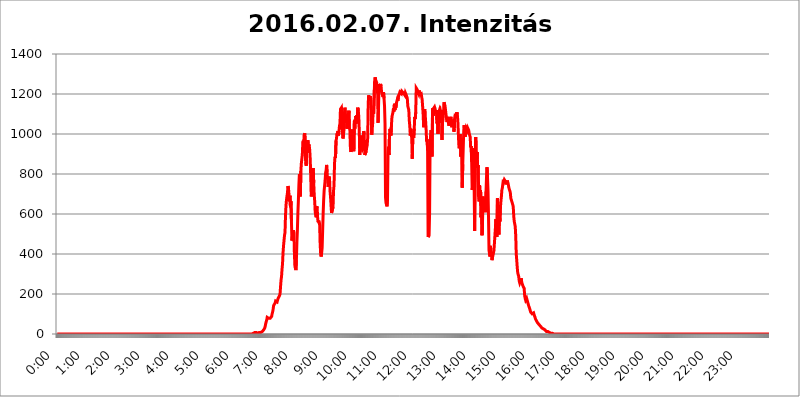
| Category | 2016.02.07. Intenzitás [W/m^2] |
|---|---|
| 0.0 | 0 |
| 0.0006944444444444445 | 0 |
| 0.001388888888888889 | 0 |
| 0.0020833333333333333 | 0 |
| 0.002777777777777778 | 0 |
| 0.003472222222222222 | 0 |
| 0.004166666666666667 | 0 |
| 0.004861111111111111 | 0 |
| 0.005555555555555556 | 0 |
| 0.0062499999999999995 | 0 |
| 0.006944444444444444 | 0 |
| 0.007638888888888889 | 0 |
| 0.008333333333333333 | 0 |
| 0.009027777777777779 | 0 |
| 0.009722222222222222 | 0 |
| 0.010416666666666666 | 0 |
| 0.011111111111111112 | 0 |
| 0.011805555555555555 | 0 |
| 0.012499999999999999 | 0 |
| 0.013194444444444444 | 0 |
| 0.013888888888888888 | 0 |
| 0.014583333333333332 | 0 |
| 0.015277777777777777 | 0 |
| 0.015972222222222224 | 0 |
| 0.016666666666666666 | 0 |
| 0.017361111111111112 | 0 |
| 0.018055555555555557 | 0 |
| 0.01875 | 0 |
| 0.019444444444444445 | 0 |
| 0.02013888888888889 | 0 |
| 0.020833333333333332 | 0 |
| 0.02152777777777778 | 0 |
| 0.022222222222222223 | 0 |
| 0.02291666666666667 | 0 |
| 0.02361111111111111 | 0 |
| 0.024305555555555556 | 0 |
| 0.024999999999999998 | 0 |
| 0.025694444444444447 | 0 |
| 0.02638888888888889 | 0 |
| 0.027083333333333334 | 0 |
| 0.027777777777777776 | 0 |
| 0.02847222222222222 | 0 |
| 0.029166666666666664 | 0 |
| 0.029861111111111113 | 0 |
| 0.030555555555555555 | 0 |
| 0.03125 | 0 |
| 0.03194444444444445 | 0 |
| 0.03263888888888889 | 0 |
| 0.03333333333333333 | 0 |
| 0.034027777777777775 | 0 |
| 0.034722222222222224 | 0 |
| 0.035416666666666666 | 0 |
| 0.036111111111111115 | 0 |
| 0.03680555555555556 | 0 |
| 0.0375 | 0 |
| 0.03819444444444444 | 0 |
| 0.03888888888888889 | 0 |
| 0.03958333333333333 | 0 |
| 0.04027777777777778 | 0 |
| 0.04097222222222222 | 0 |
| 0.041666666666666664 | 0 |
| 0.042361111111111106 | 0 |
| 0.04305555555555556 | 0 |
| 0.043750000000000004 | 0 |
| 0.044444444444444446 | 0 |
| 0.04513888888888889 | 0 |
| 0.04583333333333334 | 0 |
| 0.04652777777777778 | 0 |
| 0.04722222222222222 | 0 |
| 0.04791666666666666 | 0 |
| 0.04861111111111111 | 0 |
| 0.049305555555555554 | 0 |
| 0.049999999999999996 | 0 |
| 0.05069444444444445 | 0 |
| 0.051388888888888894 | 0 |
| 0.052083333333333336 | 0 |
| 0.05277777777777778 | 0 |
| 0.05347222222222222 | 0 |
| 0.05416666666666667 | 0 |
| 0.05486111111111111 | 0 |
| 0.05555555555555555 | 0 |
| 0.05625 | 0 |
| 0.05694444444444444 | 0 |
| 0.057638888888888885 | 0 |
| 0.05833333333333333 | 0 |
| 0.05902777777777778 | 0 |
| 0.059722222222222225 | 0 |
| 0.06041666666666667 | 0 |
| 0.061111111111111116 | 0 |
| 0.06180555555555556 | 0 |
| 0.0625 | 0 |
| 0.06319444444444444 | 0 |
| 0.06388888888888888 | 0 |
| 0.06458333333333334 | 0 |
| 0.06527777777777778 | 0 |
| 0.06597222222222222 | 0 |
| 0.06666666666666667 | 0 |
| 0.06736111111111111 | 0 |
| 0.06805555555555555 | 0 |
| 0.06874999999999999 | 0 |
| 0.06944444444444443 | 0 |
| 0.07013888888888889 | 0 |
| 0.07083333333333333 | 0 |
| 0.07152777777777779 | 0 |
| 0.07222222222222223 | 0 |
| 0.07291666666666667 | 0 |
| 0.07361111111111111 | 0 |
| 0.07430555555555556 | 0 |
| 0.075 | 0 |
| 0.07569444444444444 | 0 |
| 0.0763888888888889 | 0 |
| 0.07708333333333334 | 0 |
| 0.07777777777777778 | 0 |
| 0.07847222222222222 | 0 |
| 0.07916666666666666 | 0 |
| 0.0798611111111111 | 0 |
| 0.08055555555555556 | 0 |
| 0.08125 | 0 |
| 0.08194444444444444 | 0 |
| 0.08263888888888889 | 0 |
| 0.08333333333333333 | 0 |
| 0.08402777777777777 | 0 |
| 0.08472222222222221 | 0 |
| 0.08541666666666665 | 0 |
| 0.08611111111111112 | 0 |
| 0.08680555555555557 | 0 |
| 0.08750000000000001 | 0 |
| 0.08819444444444445 | 0 |
| 0.08888888888888889 | 0 |
| 0.08958333333333333 | 0 |
| 0.09027777777777778 | 0 |
| 0.09097222222222222 | 0 |
| 0.09166666666666667 | 0 |
| 0.09236111111111112 | 0 |
| 0.09305555555555556 | 0 |
| 0.09375 | 0 |
| 0.09444444444444444 | 0 |
| 0.09513888888888888 | 0 |
| 0.09583333333333333 | 0 |
| 0.09652777777777777 | 0 |
| 0.09722222222222222 | 0 |
| 0.09791666666666667 | 0 |
| 0.09861111111111111 | 0 |
| 0.09930555555555555 | 0 |
| 0.09999999999999999 | 0 |
| 0.10069444444444443 | 0 |
| 0.1013888888888889 | 0 |
| 0.10208333333333335 | 0 |
| 0.10277777777777779 | 0 |
| 0.10347222222222223 | 0 |
| 0.10416666666666667 | 0 |
| 0.10486111111111111 | 0 |
| 0.10555555555555556 | 0 |
| 0.10625 | 0 |
| 0.10694444444444444 | 0 |
| 0.1076388888888889 | 0 |
| 0.10833333333333334 | 0 |
| 0.10902777777777778 | 0 |
| 0.10972222222222222 | 0 |
| 0.1111111111111111 | 0 |
| 0.11180555555555556 | 0 |
| 0.11180555555555556 | 0 |
| 0.1125 | 0 |
| 0.11319444444444444 | 0 |
| 0.11388888888888889 | 0 |
| 0.11458333333333333 | 0 |
| 0.11527777777777777 | 0 |
| 0.11597222222222221 | 0 |
| 0.11666666666666665 | 0 |
| 0.1173611111111111 | 0 |
| 0.11805555555555557 | 0 |
| 0.11944444444444445 | 0 |
| 0.12013888888888889 | 0 |
| 0.12083333333333333 | 0 |
| 0.12152777777777778 | 0 |
| 0.12222222222222223 | 0 |
| 0.12291666666666667 | 0 |
| 0.12291666666666667 | 0 |
| 0.12361111111111112 | 0 |
| 0.12430555555555556 | 0 |
| 0.125 | 0 |
| 0.12569444444444444 | 0 |
| 0.12638888888888888 | 0 |
| 0.12708333333333333 | 0 |
| 0.16875 | 0 |
| 0.12847222222222224 | 0 |
| 0.12916666666666668 | 0 |
| 0.12986111111111112 | 0 |
| 0.13055555555555556 | 0 |
| 0.13125 | 0 |
| 0.13194444444444445 | 0 |
| 0.1326388888888889 | 0 |
| 0.13333333333333333 | 0 |
| 0.13402777777777777 | 0 |
| 0.13402777777777777 | 0 |
| 0.13472222222222222 | 0 |
| 0.13541666666666666 | 0 |
| 0.1361111111111111 | 0 |
| 0.13749999999999998 | 0 |
| 0.13819444444444443 | 0 |
| 0.1388888888888889 | 0 |
| 0.13958333333333334 | 0 |
| 0.14027777777777778 | 0 |
| 0.14097222222222222 | 0 |
| 0.14166666666666666 | 0 |
| 0.1423611111111111 | 0 |
| 0.14305555555555557 | 0 |
| 0.14375000000000002 | 0 |
| 0.14444444444444446 | 0 |
| 0.1451388888888889 | 0 |
| 0.1451388888888889 | 0 |
| 0.14652777777777778 | 0 |
| 0.14722222222222223 | 0 |
| 0.14791666666666667 | 0 |
| 0.1486111111111111 | 0 |
| 0.14930555555555555 | 0 |
| 0.15 | 0 |
| 0.15069444444444444 | 0 |
| 0.15138888888888888 | 0 |
| 0.15208333333333332 | 0 |
| 0.15277777777777776 | 0 |
| 0.15347222222222223 | 0 |
| 0.15416666666666667 | 0 |
| 0.15486111111111112 | 0 |
| 0.15555555555555556 | 0 |
| 0.15625 | 0 |
| 0.15694444444444444 | 0 |
| 0.15763888888888888 | 0 |
| 0.15833333333333333 | 0 |
| 0.15902777777777777 | 0 |
| 0.15972222222222224 | 0 |
| 0.16041666666666668 | 0 |
| 0.16111111111111112 | 0 |
| 0.16180555555555556 | 0 |
| 0.1625 | 0 |
| 0.16319444444444445 | 0 |
| 0.1638888888888889 | 0 |
| 0.16458333333333333 | 0 |
| 0.16527777777777777 | 0 |
| 0.16597222222222222 | 0 |
| 0.16666666666666666 | 0 |
| 0.1673611111111111 | 0 |
| 0.16805555555555554 | 0 |
| 0.16874999999999998 | 0 |
| 0.16944444444444443 | 0 |
| 0.17013888888888887 | 0 |
| 0.1708333333333333 | 0 |
| 0.17152777777777775 | 0 |
| 0.17222222222222225 | 0 |
| 0.1729166666666667 | 0 |
| 0.17361111111111113 | 0 |
| 0.17430555555555557 | 0 |
| 0.17500000000000002 | 0 |
| 0.17569444444444446 | 0 |
| 0.1763888888888889 | 0 |
| 0.17708333333333334 | 0 |
| 0.17777777777777778 | 0 |
| 0.17847222222222223 | 0 |
| 0.17916666666666667 | 0 |
| 0.1798611111111111 | 0 |
| 0.18055555555555555 | 0 |
| 0.18125 | 0 |
| 0.18194444444444444 | 0 |
| 0.1826388888888889 | 0 |
| 0.18333333333333335 | 0 |
| 0.1840277777777778 | 0 |
| 0.18472222222222223 | 0 |
| 0.18541666666666667 | 0 |
| 0.18611111111111112 | 0 |
| 0.18680555555555556 | 0 |
| 0.1875 | 0 |
| 0.18819444444444444 | 0 |
| 0.18888888888888888 | 0 |
| 0.18958333333333333 | 0 |
| 0.19027777777777777 | 0 |
| 0.1909722222222222 | 0 |
| 0.19166666666666665 | 0 |
| 0.19236111111111112 | 0 |
| 0.19305555555555554 | 0 |
| 0.19375 | 0 |
| 0.19444444444444445 | 0 |
| 0.1951388888888889 | 0 |
| 0.19583333333333333 | 0 |
| 0.19652777777777777 | 0 |
| 0.19722222222222222 | 0 |
| 0.19791666666666666 | 0 |
| 0.1986111111111111 | 0 |
| 0.19930555555555554 | 0 |
| 0.19999999999999998 | 0 |
| 0.20069444444444443 | 0 |
| 0.20138888888888887 | 0 |
| 0.2020833333333333 | 0 |
| 0.2027777777777778 | 0 |
| 0.2034722222222222 | 0 |
| 0.2041666666666667 | 0 |
| 0.20486111111111113 | 0 |
| 0.20555555555555557 | 0 |
| 0.20625000000000002 | 0 |
| 0.20694444444444446 | 0 |
| 0.2076388888888889 | 0 |
| 0.20833333333333334 | 0 |
| 0.20902777777777778 | 0 |
| 0.20972222222222223 | 0 |
| 0.21041666666666667 | 0 |
| 0.2111111111111111 | 0 |
| 0.21180555555555555 | 0 |
| 0.2125 | 0 |
| 0.21319444444444444 | 0 |
| 0.2138888888888889 | 0 |
| 0.21458333333333335 | 0 |
| 0.2152777777777778 | 0 |
| 0.21597222222222223 | 0 |
| 0.21666666666666667 | 0 |
| 0.21736111111111112 | 0 |
| 0.21805555555555556 | 0 |
| 0.21875 | 0 |
| 0.21944444444444444 | 0 |
| 0.22013888888888888 | 0 |
| 0.22083333333333333 | 0 |
| 0.22152777777777777 | 0 |
| 0.2222222222222222 | 0 |
| 0.22291666666666665 | 0 |
| 0.2236111111111111 | 0 |
| 0.22430555555555556 | 0 |
| 0.225 | 0 |
| 0.22569444444444445 | 0 |
| 0.2263888888888889 | 0 |
| 0.22708333333333333 | 0 |
| 0.22777777777777777 | 0 |
| 0.22847222222222222 | 0 |
| 0.22916666666666666 | 0 |
| 0.2298611111111111 | 0 |
| 0.23055555555555554 | 0 |
| 0.23124999999999998 | 0 |
| 0.23194444444444443 | 0 |
| 0.23263888888888887 | 0 |
| 0.2333333333333333 | 0 |
| 0.2340277777777778 | 0 |
| 0.2347222222222222 | 0 |
| 0.2354166666666667 | 0 |
| 0.23611111111111113 | 0 |
| 0.23680555555555557 | 0 |
| 0.23750000000000002 | 0 |
| 0.23819444444444446 | 0 |
| 0.2388888888888889 | 0 |
| 0.23958333333333334 | 0 |
| 0.24027777777777778 | 0 |
| 0.24097222222222223 | 0 |
| 0.24166666666666667 | 0 |
| 0.2423611111111111 | 0 |
| 0.24305555555555555 | 0 |
| 0.24375 | 0 |
| 0.24444444444444446 | 0 |
| 0.24513888888888888 | 0 |
| 0.24583333333333335 | 0 |
| 0.2465277777777778 | 0 |
| 0.24722222222222223 | 0 |
| 0.24791666666666667 | 0 |
| 0.24861111111111112 | 0 |
| 0.24930555555555556 | 0 |
| 0.25 | 0 |
| 0.25069444444444444 | 0 |
| 0.2513888888888889 | 0 |
| 0.2520833333333333 | 0 |
| 0.25277777777777777 | 0 |
| 0.2534722222222222 | 0 |
| 0.25416666666666665 | 0 |
| 0.2548611111111111 | 0 |
| 0.2555555555555556 | 0 |
| 0.25625000000000003 | 0 |
| 0.2569444444444445 | 0 |
| 0.2576388888888889 | 0 |
| 0.25833333333333336 | 0 |
| 0.2590277777777778 | 0 |
| 0.25972222222222224 | 0 |
| 0.2604166666666667 | 0 |
| 0.2611111111111111 | 0 |
| 0.26180555555555557 | 0 |
| 0.2625 | 0 |
| 0.26319444444444445 | 0 |
| 0.2638888888888889 | 0 |
| 0.26458333333333334 | 0 |
| 0.2652777777777778 | 0 |
| 0.2659722222222222 | 0 |
| 0.26666666666666666 | 0 |
| 0.2673611111111111 | 0 |
| 0.26805555555555555 | 0 |
| 0.26875 | 0 |
| 0.26944444444444443 | 0 |
| 0.2701388888888889 | 0 |
| 0.2708333333333333 | 0 |
| 0.27152777777777776 | 0 |
| 0.2722222222222222 | 0 |
| 0.27291666666666664 | 0 |
| 0.2736111111111111 | 3.525 |
| 0.2743055555555555 | 3.525 |
| 0.27499999999999997 | 3.525 |
| 0.27569444444444446 | 3.525 |
| 0.27638888888888885 | 7.887 |
| 0.27708333333333335 | 7.887 |
| 0.2777777777777778 | 7.887 |
| 0.27847222222222223 | 7.887 |
| 0.2791666666666667 | 7.887 |
| 0.2798611111111111 | 3.525 |
| 0.28055555555555556 | 3.525 |
| 0.28125 | 3.525 |
| 0.28194444444444444 | 3.525 |
| 0.2826388888888889 | 3.525 |
| 0.2833333333333333 | 7.887 |
| 0.28402777777777777 | 7.887 |
| 0.2847222222222222 | 7.887 |
| 0.28541666666666665 | 7.887 |
| 0.28611111111111115 | 12.257 |
| 0.28680555555555554 | 12.257 |
| 0.28750000000000003 | 12.257 |
| 0.2881944444444445 | 16.636 |
| 0.2888888888888889 | 16.636 |
| 0.28958333333333336 | 21.024 |
| 0.2902777777777778 | 25.419 |
| 0.29097222222222224 | 29.823 |
| 0.2916666666666667 | 38.653 |
| 0.2923611111111111 | 51.951 |
| 0.29305555555555557 | 60.85 |
| 0.29375 | 69.775 |
| 0.29444444444444445 | 83.205 |
| 0.2951388888888889 | 87.692 |
| 0.29583333333333334 | 83.205 |
| 0.2965277777777778 | 78.722 |
| 0.2972222222222222 | 74.246 |
| 0.29791666666666666 | 74.246 |
| 0.2986111111111111 | 78.722 |
| 0.29930555555555555 | 83.205 |
| 0.3 | 83.205 |
| 0.30069444444444443 | 87.692 |
| 0.3013888888888889 | 101.184 |
| 0.3020833333333333 | 110.201 |
| 0.30277777777777776 | 123.758 |
| 0.3034722222222222 | 141.884 |
| 0.30416666666666664 | 141.884 |
| 0.3048611111111111 | 141.884 |
| 0.3055555555555555 | 155.509 |
| 0.30624999999999997 | 164.605 |
| 0.3069444444444444 | 164.605 |
| 0.3076388888888889 | 169.156 |
| 0.30833333333333335 | 160.056 |
| 0.3090277777777778 | 164.605 |
| 0.30972222222222223 | 178.264 |
| 0.3104166666666667 | 182.82 |
| 0.3111111111111111 | 182.82 |
| 0.31180555555555556 | 191.937 |
| 0.3125 | 201.058 |
| 0.31319444444444444 | 237.564 |
| 0.3138888888888889 | 269.49 |
| 0.3145833333333333 | 287.709 |
| 0.31527777777777777 | 324.052 |
| 0.3159722222222222 | 351.198 |
| 0.31666666666666665 | 405.108 |
| 0.31736111111111115 | 440.702 |
| 0.31805555555555554 | 467.187 |
| 0.31875000000000003 | 493.475 |
| 0.3194444444444445 | 506.542 |
| 0.3201388888888889 | 592.233 |
| 0.32083333333333336 | 642.4 |
| 0.3215277777777778 | 671.22 |
| 0.32222222222222224 | 671.22 |
| 0.3229166666666667 | 707.8 |
| 0.3236111111111111 | 739.877 |
| 0.32430555555555557 | 727.896 |
| 0.325 | 699.717 |
| 0.32569444444444445 | 663.019 |
| 0.3263888888888889 | 691.608 |
| 0.32708333333333334 | 634.105 |
| 0.3277777777777778 | 663.019 |
| 0.3284722222222222 | 562.53 |
| 0.32916666666666666 | 467.187 |
| 0.3298611111111111 | 489.108 |
| 0.33055555555555555 | 510.885 |
| 0.33125 | 519.555 |
| 0.33194444444444443 | 502.192 |
| 0.3326388888888889 | 400.638 |
| 0.3333333333333333 | 337.639 |
| 0.3340277777777778 | 328.584 |
| 0.3347222222222222 | 319.517 |
| 0.3354166666666667 | 369.23 |
| 0.3361111111111111 | 458.38 |
| 0.3368055555555556 | 519.555 |
| 0.33749999999999997 | 604.864 |
| 0.33819444444444446 | 667.123 |
| 0.33888888888888885 | 743.859 |
| 0.33958333333333335 | 798.974 |
| 0.34027777777777773 | 727.896 |
| 0.34097222222222223 | 687.544 |
| 0.3416666666666666 | 814.519 |
| 0.3423611111111111 | 853.029 |
| 0.3430555555555555 | 849.199 |
| 0.34375 | 898.668 |
| 0.3444444444444445 | 958.814 |
| 0.3451388888888889 | 966.295 |
| 0.3458333333333334 | 940.082 |
| 0.34652777777777777 | 996.182 |
| 0.34722222222222227 | 1003.65 |
| 0.34791666666666665 | 891.099 |
| 0.34861111111111115 | 853.029 |
| 0.34930555555555554 | 841.526 |
| 0.35000000000000003 | 951.327 |
| 0.3506944444444444 | 906.223 |
| 0.3513888888888889 | 970.034 |
| 0.3520833333333333 | 928.819 |
| 0.3527777777777778 | 947.58 |
| 0.3534722222222222 | 940.082 |
| 0.3541666666666667 | 917.534 |
| 0.3548611111111111 | 868.305 |
| 0.35555555555555557 | 783.342 |
| 0.35625 | 687.544 |
| 0.35694444444444445 | 703.762 |
| 0.3576388888888889 | 791.169 |
| 0.35833333333333334 | 791.169 |
| 0.3590277777777778 | 829.981 |
| 0.3597222222222222 | 755.766 |
| 0.36041666666666666 | 695.666 |
| 0.3611111111111111 | 663.019 |
| 0.36180555555555555 | 609.062 |
| 0.3625 | 604.864 |
| 0.36319444444444443 | 583.779 |
| 0.3638888888888889 | 638.256 |
| 0.3645833333333333 | 629.948 |
| 0.3652777777777778 | 575.299 |
| 0.3659722222222222 | 558.261 |
| 0.3666666666666667 | 566.793 |
| 0.3673611111111111 | 562.53 |
| 0.3680555555555556 | 545.416 |
| 0.36874999999999997 | 449.551 |
| 0.36944444444444446 | 400.638 |
| 0.37013888888888885 | 387.202 |
| 0.37083333333333335 | 405.108 |
| 0.37152777777777773 | 431.833 |
| 0.37222222222222223 | 515.223 |
| 0.3729166666666666 | 600.661 |
| 0.3736111111111111 | 667.123 |
| 0.3743055555555555 | 715.858 |
| 0.375 | 715.858 |
| 0.3756944444444445 | 767.62 |
| 0.3763888888888889 | 806.757 |
| 0.3770833333333334 | 818.392 |
| 0.37777777777777777 | 845.365 |
| 0.37847222222222227 | 806.757 |
| 0.37916666666666665 | 775.492 |
| 0.37986111111111115 | 735.89 |
| 0.38055555555555554 | 743.859 |
| 0.38125000000000003 | 787.258 |
| 0.3819444444444444 | 771.559 |
| 0.3826388888888889 | 711.832 |
| 0.3833333333333333 | 683.473 |
| 0.3840277777777778 | 642.4 |
| 0.3847222222222222 | 604.864 |
| 0.3854166666666667 | 604.864 |
| 0.3861111111111111 | 609.062 |
| 0.38680555555555557 | 634.105 |
| 0.3875 | 715.858 |
| 0.38819444444444445 | 743.859 |
| 0.3888888888888889 | 853.029 |
| 0.38958333333333334 | 887.309 |
| 0.3902777777777778 | 879.719 |
| 0.3909722222222222 | 966.295 |
| 0.39166666666666666 | 977.508 |
| 0.3923611111111111 | 1003.65 |
| 0.39305555555555555 | 996.182 |
| 0.39375 | 1014.852 |
| 0.39444444444444443 | 992.448 |
| 0.3951388888888889 | 1014.852 |
| 0.3958333333333333 | 1041.019 |
| 0.3965277777777778 | 1052.255 |
| 0.3972222222222222 | 1124.056 |
| 0.3979166666666667 | 1127.879 |
| 0.3986111111111111 | 1131.708 |
| 0.3993055555555556 | 1097.437 |
| 0.39999999999999997 | 1007.383 |
| 0.40069444444444446 | 977.508 |
| 0.40138888888888885 | 996.182 |
| 0.40208333333333335 | 1018.587 |
| 0.40277777777777773 | 1101.226 |
| 0.40347222222222223 | 1131.708 |
| 0.4041666666666666 | 1093.653 |
| 0.4048611111111111 | 1086.097 |
| 0.4055555555555555 | 1078.555 |
| 0.40625 | 1026.06 |
| 0.4069444444444445 | 1078.555 |
| 0.4076388888888889 | 1101.226 |
| 0.4083333333333334 | 1093.653 |
| 0.40902777777777777 | 1116.426 |
| 0.40972222222222227 | 1029.798 |
| 0.41041666666666665 | 1018.587 |
| 0.41111111111111115 | 936.33 |
| 0.41180555555555554 | 909.996 |
| 0.41250000000000003 | 906.223 |
| 0.4131944444444444 | 951.327 |
| 0.4138888888888889 | 1022.323 |
| 0.4145833333333333 | 970.034 |
| 0.4152777777777778 | 951.327 |
| 0.4159722222222222 | 913.766 |
| 0.4166666666666667 | 1052.255 |
| 0.4173611111111111 | 1056.004 |
| 0.41805555555555557 | 1044.762 |
| 0.41875 | 1089.873 |
| 0.41944444444444445 | 1052.255 |
| 0.4201388888888889 | 1093.653 |
| 0.42083333333333334 | 1071.027 |
| 0.4215277777777778 | 1131.708 |
| 0.4222222222222222 | 1116.426 |
| 0.42291666666666666 | 1086.097 |
| 0.4236111111111111 | 1011.118 |
| 0.42430555555555555 | 894.885 |
| 0.425 | 962.555 |
| 0.42569444444444443 | 992.448 |
| 0.4263888888888889 | 940.082 |
| 0.4270833333333333 | 940.082 |
| 0.4277777777777778 | 925.06 |
| 0.4284722222222222 | 932.576 |
| 0.4291666666666667 | 984.98 |
| 0.4298611111111111 | 1014.852 |
| 0.4305555555555556 | 999.916 |
| 0.43124999999999997 | 894.885 |
| 0.43194444444444446 | 894.885 |
| 0.43263888888888885 | 898.668 |
| 0.43333333333333335 | 913.766 |
| 0.43402777777777773 | 932.576 |
| 0.43472222222222223 | 943.832 |
| 0.4354166666666666 | 981.244 |
| 0.4361111111111111 | 1150.946 |
| 0.4368055555555555 | 1193.918 |
| 0.4375 | 1174.263 |
| 0.4381944444444445 | 1166.46 |
| 0.4388888888888889 | 1189.969 |
| 0.4395833333333334 | 1166.46 |
| 0.44027777777777777 | 1116.426 |
| 0.44097222222222227 | 996.182 |
| 0.44166666666666665 | 1018.587 |
| 0.44236111111111115 | 1052.255 |
| 0.44305555555555554 | 1120.238 |
| 0.44375000000000003 | 1101.226 |
| 0.4444444444444444 | 1101.226 |
| 0.4451388888888889 | 1262.649 |
| 0.4458333333333333 | 1283.541 |
| 0.4465277777777778 | 1270.964 |
| 0.4472222222222222 | 1266.8 |
| 0.4479166666666667 | 1258.511 |
| 0.4486111111111111 | 1238.014 |
| 0.44930555555555557 | 1209.807 |
| 0.45 | 1056.004 |
| 0.45069444444444445 | 1147.086 |
| 0.4513888888888889 | 1250.275 |
| 0.45208333333333334 | 1246.176 |
| 0.4527777777777778 | 1229.899 |
| 0.4534722222222222 | 1250.275 |
| 0.45416666666666666 | 1238.014 |
| 0.4548611111111111 | 1209.807 |
| 0.45555555555555555 | 1205.82 |
| 0.45625 | 1209.807 |
| 0.45694444444444443 | 1186.03 |
| 0.4576388888888889 | 1209.807 |
| 0.4583333333333333 | 1178.177 |
| 0.4590277777777778 | 1139.384 |
| 0.4597222222222222 | 1052.255 |
| 0.4604166666666667 | 683.473 |
| 0.4611111111111111 | 654.791 |
| 0.4618055555555556 | 654.791 |
| 0.46249999999999997 | 638.256 |
| 0.46319444444444446 | 675.311 |
| 0.46388888888888885 | 894.885 |
| 0.46458333333333335 | 936.33 |
| 0.46527777777777773 | 894.885 |
| 0.46597222222222223 | 996.182 |
| 0.4666666666666666 | 1026.06 |
| 0.4673611111111111 | 1026.06 |
| 0.4680555555555555 | 992.448 |
| 0.46875 | 1044.762 |
| 0.4694444444444445 | 1086.097 |
| 0.4701388888888889 | 1086.097 |
| 0.4708333333333334 | 1108.816 |
| 0.47152777777777777 | 1127.879 |
| 0.47222222222222227 | 1112.618 |
| 0.47291666666666665 | 1150.946 |
| 0.47361111111111115 | 1120.238 |
| 0.47430555555555554 | 1139.384 |
| 0.47500000000000003 | 1131.708 |
| 0.4756944444444444 | 1154.814 |
| 0.4763888888888889 | 1154.814 |
| 0.4770833333333333 | 1174.263 |
| 0.4777777777777778 | 1166.46 |
| 0.4784722222222222 | 1186.03 |
| 0.4791666666666667 | 1186.03 |
| 0.4798611111111111 | 1201.843 |
| 0.48055555555555557 | 1209.807 |
| 0.48125 | 1213.804 |
| 0.48194444444444445 | 1205.82 |
| 0.4826388888888889 | 1201.843 |
| 0.48333333333333334 | 1213.804 |
| 0.4840277777777778 | 1213.804 |
| 0.4847222222222222 | 1209.807 |
| 0.48541666666666666 | 1205.82 |
| 0.4861111111111111 | 1209.807 |
| 0.48680555555555555 | 1205.82 |
| 0.4875 | 1193.918 |
| 0.48819444444444443 | 1205.82 |
| 0.4888888888888889 | 1201.843 |
| 0.4895833333333333 | 1193.918 |
| 0.4902777777777778 | 1189.969 |
| 0.4909722222222222 | 1178.177 |
| 0.4916666666666667 | 1139.384 |
| 0.4923611111111111 | 1135.543 |
| 0.4930555555555556 | 1120.238 |
| 0.49374999999999997 | 1067.267 |
| 0.49444444444444446 | 1041.019 |
| 0.49513888888888885 | 992.448 |
| 0.49583333333333335 | 1026.06 |
| 0.49652777777777773 | 1011.118 |
| 0.49722222222222223 | 973.772 |
| 0.4979166666666666 | 875.918 |
| 0.4986111111111111 | 973.772 |
| 0.4993055555555555 | 992.448 |
| 0.5 | 981.244 |
| 0.5006944444444444 | 1026.06 |
| 0.5013888888888889 | 1086.097 |
| 0.5020833333333333 | 1074.789 |
| 0.5027777777777778 | 1108.816 |
| 0.5034722222222222 | 1229.899 |
| 0.5041666666666667 | 1229.899 |
| 0.5048611111111111 | 1221.83 |
| 0.5055555555555555 | 1213.804 |
| 0.50625 | 1213.804 |
| 0.5069444444444444 | 1201.843 |
| 0.5076388888888889 | 1217.812 |
| 0.5083333333333333 | 1197.876 |
| 0.5090277777777777 | 1193.918 |
| 0.5097222222222222 | 1201.843 |
| 0.5104166666666666 | 1201.843 |
| 0.5111111111111112 | 1186.03 |
| 0.5118055555555555 | 1170.358 |
| 0.5125000000000001 | 1135.543 |
| 0.5131944444444444 | 1097.437 |
| 0.513888888888889 | 1033.537 |
| 0.5145833333333333 | 1037.277 |
| 0.5152777777777778 | 1124.056 |
| 0.5159722222222222 | 1101.226 |
| 0.5166666666666667 | 1063.51 |
| 0.517361111111111 | 1022.323 |
| 0.5180555555555556 | 962.555 |
| 0.5187499999999999 | 973.772 |
| 0.5194444444444445 | 917.534 |
| 0.5201388888888888 | 484.735 |
| 0.5208333333333334 | 489.108 |
| 0.5215277777777778 | 493.475 |
| 0.5222222222222223 | 604.864 |
| 0.5229166666666667 | 943.832 |
| 0.5236111111111111 | 992.448 |
| 0.5243055555555556 | 1018.587 |
| 0.525 | 970.034 |
| 0.5256944444444445 | 887.309 |
| 0.5263888888888889 | 1127.879 |
| 0.5270833333333333 | 1089.873 |
| 0.5277777777777778 | 1127.879 |
| 0.5284722222222222 | 1131.708 |
| 0.5291666666666667 | 1135.543 |
| 0.5298611111111111 | 1127.879 |
| 0.5305555555555556 | 1127.879 |
| 0.53125 | 1101.226 |
| 0.5319444444444444 | 1120.238 |
| 0.5326388888888889 | 1052.255 |
| 0.5333333333333333 | 1059.756 |
| 0.5340277777777778 | 999.916 |
| 0.5347222222222222 | 1052.255 |
| 0.5354166666666667 | 1112.618 |
| 0.5361111111111111 | 1120.238 |
| 0.5368055555555555 | 1108.816 |
| 0.5375 | 1116.426 |
| 0.5381944444444444 | 1116.426 |
| 0.5388888888888889 | 1093.653 |
| 0.5395833333333333 | 970.034 |
| 0.5402777777777777 | 1056.004 |
| 0.5409722222222222 | 1071.027 |
| 0.5416666666666666 | 1101.226 |
| 0.5423611111111112 | 1158.689 |
| 0.5430555555555555 | 1150.946 |
| 0.5437500000000001 | 1143.232 |
| 0.5444444444444444 | 1124.056 |
| 0.545138888888889 | 1101.226 |
| 0.5458333333333333 | 1101.226 |
| 0.5465277777777778 | 1059.756 |
| 0.5472222222222222 | 1067.267 |
| 0.5479166666666667 | 1086.097 |
| 0.548611111111111 | 1056.004 |
| 0.5493055555555556 | 1041.019 |
| 0.5499999999999999 | 1044.762 |
| 0.5506944444444445 | 1044.762 |
| 0.5513888888888888 | 1067.267 |
| 0.5520833333333334 | 1086.097 |
| 0.5527777777777778 | 1063.51 |
| 0.5534722222222223 | 1033.537 |
| 0.5541666666666667 | 1056.004 |
| 0.5548611111111111 | 1056.004 |
| 0.5555555555555556 | 1063.51 |
| 0.55625 | 1011.118 |
| 0.5569444444444445 | 1026.06 |
| 0.5576388888888889 | 1086.097 |
| 0.5583333333333333 | 1101.226 |
| 0.5590277777777778 | 1086.097 |
| 0.5597222222222222 | 1078.555 |
| 0.5604166666666667 | 1108.816 |
| 0.5611111111111111 | 1097.437 |
| 0.5618055555555556 | 1067.267 |
| 0.5625 | 1067.267 |
| 0.5631944444444444 | 947.58 |
| 0.5638888888888889 | 928.819 |
| 0.5645833333333333 | 973.772 |
| 0.5652777777777778 | 999.916 |
| 0.5659722222222222 | 887.309 |
| 0.5666666666666667 | 909.996 |
| 0.5673611111111111 | 977.508 |
| 0.5680555555555555 | 731.896 |
| 0.56875 | 849.199 |
| 0.5694444444444444 | 845.365 |
| 0.5701388888888889 | 1018.587 |
| 0.5708333333333333 | 1044.762 |
| 0.5715277777777777 | 992.448 |
| 0.5722222222222222 | 984.98 |
| 0.5729166666666666 | 1014.852 |
| 0.5736111111111112 | 1029.798 |
| 0.5743055555555555 | 1029.798 |
| 0.5750000000000001 | 1018.587 |
| 0.5756944444444444 | 1029.798 |
| 0.576388888888889 | 1026.06 |
| 0.5770833333333333 | 1018.587 |
| 0.5777777777777778 | 1003.65 |
| 0.5784722222222222 | 992.448 |
| 0.5791666666666667 | 984.98 |
| 0.579861111111111 | 932.576 |
| 0.5805555555555556 | 940.082 |
| 0.5812499999999999 | 860.676 |
| 0.5819444444444445 | 719.877 |
| 0.5826388888888888 | 739.877 |
| 0.5833333333333334 | 928.819 |
| 0.5840277777777778 | 925.06 |
| 0.5847222222222223 | 731.896 |
| 0.5854166666666667 | 515.223 |
| 0.5861111111111111 | 853.029 |
| 0.5868055555555556 | 984.98 |
| 0.5875 | 947.58 |
| 0.5881944444444445 | 875.918 |
| 0.5888888888888889 | 909.996 |
| 0.5895833333333333 | 829.981 |
| 0.5902777777777778 | 845.365 |
| 0.5909722222222222 | 687.544 |
| 0.5916666666666667 | 663.019 |
| 0.5923611111111111 | 743.859 |
| 0.5930555555555556 | 699.717 |
| 0.59375 | 719.877 |
| 0.5944444444444444 | 583.779 |
| 0.5951388888888889 | 629.948 |
| 0.5958333333333333 | 493.475 |
| 0.5965277777777778 | 575.299 |
| 0.5972222222222222 | 687.544 |
| 0.5979166666666667 | 638.256 |
| 0.5986111111111111 | 654.791 |
| 0.5993055555555555 | 675.311 |
| 0.6 | 658.909 |
| 0.6006944444444444 | 609.062 |
| 0.6013888888888889 | 711.832 |
| 0.6020833333333333 | 787.258 |
| 0.6027777777777777 | 833.834 |
| 0.6034722222222222 | 779.42 |
| 0.6041666666666666 | 715.858 |
| 0.6048611111111112 | 588.009 |
| 0.6055555555555555 | 418.492 |
| 0.6062500000000001 | 414.035 |
| 0.6069444444444444 | 387.202 |
| 0.607638888888889 | 440.702 |
| 0.6083333333333333 | 405.108 |
| 0.6090277777777778 | 396.164 |
| 0.6097222222222222 | 369.23 |
| 0.6104166666666667 | 382.715 |
| 0.611111111111111 | 378.224 |
| 0.6118055555555556 | 405.108 |
| 0.6124999999999999 | 418.492 |
| 0.6131944444444445 | 422.943 |
| 0.6138888888888888 | 414.035 |
| 0.6145833333333334 | 532.513 |
| 0.6152777777777778 | 575.299 |
| 0.6159722222222223 | 497.836 |
| 0.6166666666666667 | 484.735 |
| 0.6173611111111111 | 679.395 |
| 0.6180555555555556 | 634.105 |
| 0.61875 | 566.793 |
| 0.6194444444444445 | 497.836 |
| 0.6201388888888889 | 592.233 |
| 0.6208333333333333 | 562.53 |
| 0.6215277777777778 | 629.948 |
| 0.6222222222222222 | 663.019 |
| 0.6229166666666667 | 687.544 |
| 0.6236111111111111 | 719.877 |
| 0.6243055555555556 | 731.896 |
| 0.625 | 751.803 |
| 0.6256944444444444 | 771.559 |
| 0.6263888888888889 | 763.674 |
| 0.6270833333333333 | 771.559 |
| 0.6277777777777778 | 775.492 |
| 0.6284722222222222 | 767.62 |
| 0.6291666666666667 | 759.723 |
| 0.6298611111111111 | 747.834 |
| 0.6305555555555555 | 759.723 |
| 0.63125 | 767.62 |
| 0.6319444444444444 | 755.766 |
| 0.6326388888888889 | 747.834 |
| 0.6333333333333333 | 731.896 |
| 0.6340277777777777 | 731.896 |
| 0.6347222222222222 | 731.896 |
| 0.6354166666666666 | 707.8 |
| 0.6361111111111112 | 679.395 |
| 0.6368055555555555 | 671.22 |
| 0.6375000000000001 | 667.123 |
| 0.6381944444444444 | 667.123 |
| 0.638888888888889 | 646.537 |
| 0.6395833333333333 | 634.105 |
| 0.6402777777777778 | 588.009 |
| 0.6409722222222222 | 562.53 |
| 0.6416666666666667 | 549.704 |
| 0.642361111111111 | 536.82 |
| 0.6430555555555556 | 489.108 |
| 0.6437499999999999 | 400.638 |
| 0.6444444444444445 | 369.23 |
| 0.6451388888888888 | 333.113 |
| 0.6458333333333334 | 305.898 |
| 0.6465277777777778 | 301.354 |
| 0.6472222222222223 | 287.709 |
| 0.6479166666666667 | 264.932 |
| 0.6486111111111111 | 255.813 |
| 0.6493055555555556 | 255.813 |
| 0.65 | 269.49 |
| 0.6506944444444445 | 278.603 |
| 0.6513888888888889 | 260.373 |
| 0.6520833333333333 | 251.251 |
| 0.6527777777777778 | 246.689 |
| 0.6534722222222222 | 237.564 |
| 0.6541666666666667 | 242.127 |
| 0.6548611111111111 | 228.436 |
| 0.6555555555555556 | 191.937 |
| 0.65625 | 178.264 |
| 0.6569444444444444 | 169.156 |
| 0.6576388888888889 | 169.156 |
| 0.6583333333333333 | 178.264 |
| 0.6590277777777778 | 173.709 |
| 0.6597222222222222 | 160.056 |
| 0.6604166666666667 | 150.964 |
| 0.6611111111111111 | 141.884 |
| 0.6618055555555555 | 137.347 |
| 0.6625 | 128.284 |
| 0.6631944444444444 | 119.235 |
| 0.6638888888888889 | 110.201 |
| 0.6645833333333333 | 110.201 |
| 0.6652777777777777 | 105.69 |
| 0.6659722222222222 | 101.184 |
| 0.6666666666666666 | 105.69 |
| 0.6673611111111111 | 105.69 |
| 0.6680555555555556 | 105.69 |
| 0.6687500000000001 | 96.682 |
| 0.6694444444444444 | 92.184 |
| 0.6701388888888888 | 83.205 |
| 0.6708333333333334 | 74.246 |
| 0.6715277777777778 | 69.775 |
| 0.6722222222222222 | 65.31 |
| 0.6729166666666666 | 60.85 |
| 0.6736111111111112 | 56.398 |
| 0.6743055555555556 | 56.398 |
| 0.6749999999999999 | 51.951 |
| 0.6756944444444444 | 47.511 |
| 0.6763888888888889 | 43.079 |
| 0.6770833333333334 | 43.079 |
| 0.6777777777777777 | 38.653 |
| 0.6784722222222223 | 38.653 |
| 0.6791666666666667 | 34.234 |
| 0.6798611111111111 | 29.823 |
| 0.6805555555555555 | 29.823 |
| 0.68125 | 29.823 |
| 0.6819444444444445 | 25.419 |
| 0.6826388888888889 | 21.024 |
| 0.6833333333333332 | 21.024 |
| 0.6840277777777778 | 21.024 |
| 0.6847222222222222 | 16.636 |
| 0.6854166666666667 | 16.636 |
| 0.686111111111111 | 12.257 |
| 0.6868055555555556 | 12.257 |
| 0.6875 | 12.257 |
| 0.6881944444444444 | 12.257 |
| 0.688888888888889 | 7.887 |
| 0.6895833333333333 | 7.887 |
| 0.6902777777777778 | 7.887 |
| 0.6909722222222222 | 3.525 |
| 0.6916666666666668 | 3.525 |
| 0.6923611111111111 | 3.525 |
| 0.6930555555555555 | 3.525 |
| 0.69375 | 3.525 |
| 0.6944444444444445 | 3.525 |
| 0.6951388888888889 | 3.525 |
| 0.6958333333333333 | 3.525 |
| 0.6965277777777777 | 0 |
| 0.6972222222222223 | 0 |
| 0.6979166666666666 | 0 |
| 0.6986111111111111 | 0 |
| 0.6993055555555556 | 0 |
| 0.7000000000000001 | 0 |
| 0.7006944444444444 | 0 |
| 0.7013888888888888 | 0 |
| 0.7020833333333334 | 0 |
| 0.7027777777777778 | 0 |
| 0.7034722222222222 | 0 |
| 0.7041666666666666 | 0 |
| 0.7048611111111112 | 0 |
| 0.7055555555555556 | 0 |
| 0.7062499999999999 | 0 |
| 0.7069444444444444 | 0 |
| 0.7076388888888889 | 0 |
| 0.7083333333333334 | 0 |
| 0.7090277777777777 | 0 |
| 0.7097222222222223 | 0 |
| 0.7104166666666667 | 0 |
| 0.7111111111111111 | 0 |
| 0.7118055555555555 | 0 |
| 0.7125 | 0 |
| 0.7131944444444445 | 0 |
| 0.7138888888888889 | 0 |
| 0.7145833333333332 | 0 |
| 0.7152777777777778 | 0 |
| 0.7159722222222222 | 0 |
| 0.7166666666666667 | 0 |
| 0.717361111111111 | 0 |
| 0.7180555555555556 | 0 |
| 0.71875 | 0 |
| 0.7194444444444444 | 0 |
| 0.720138888888889 | 0 |
| 0.7208333333333333 | 0 |
| 0.7215277777777778 | 0 |
| 0.7222222222222222 | 0 |
| 0.7229166666666668 | 0 |
| 0.7236111111111111 | 0 |
| 0.7243055555555555 | 0 |
| 0.725 | 0 |
| 0.7256944444444445 | 0 |
| 0.7263888888888889 | 0 |
| 0.7270833333333333 | 0 |
| 0.7277777777777777 | 0 |
| 0.7284722222222223 | 0 |
| 0.7291666666666666 | 0 |
| 0.7298611111111111 | 0 |
| 0.7305555555555556 | 0 |
| 0.7312500000000001 | 0 |
| 0.7319444444444444 | 0 |
| 0.7326388888888888 | 0 |
| 0.7333333333333334 | 0 |
| 0.7340277777777778 | 0 |
| 0.7347222222222222 | 0 |
| 0.7354166666666666 | 0 |
| 0.7361111111111112 | 0 |
| 0.7368055555555556 | 0 |
| 0.7374999999999999 | 0 |
| 0.7381944444444444 | 0 |
| 0.7388888888888889 | 0 |
| 0.7395833333333334 | 0 |
| 0.7402777777777777 | 0 |
| 0.7409722222222223 | 0 |
| 0.7416666666666667 | 0 |
| 0.7423611111111111 | 0 |
| 0.7430555555555555 | 0 |
| 0.74375 | 0 |
| 0.7444444444444445 | 0 |
| 0.7451388888888889 | 0 |
| 0.7458333333333332 | 0 |
| 0.7465277777777778 | 0 |
| 0.7472222222222222 | 0 |
| 0.7479166666666667 | 0 |
| 0.748611111111111 | 0 |
| 0.7493055555555556 | 0 |
| 0.75 | 0 |
| 0.7506944444444444 | 0 |
| 0.751388888888889 | 0 |
| 0.7520833333333333 | 0 |
| 0.7527777777777778 | 0 |
| 0.7534722222222222 | 0 |
| 0.7541666666666668 | 0 |
| 0.7548611111111111 | 0 |
| 0.7555555555555555 | 0 |
| 0.75625 | 0 |
| 0.7569444444444445 | 0 |
| 0.7576388888888889 | 0 |
| 0.7583333333333333 | 0 |
| 0.7590277777777777 | 0 |
| 0.7597222222222223 | 0 |
| 0.7604166666666666 | 0 |
| 0.7611111111111111 | 0 |
| 0.7618055555555556 | 0 |
| 0.7625000000000001 | 0 |
| 0.7631944444444444 | 0 |
| 0.7638888888888888 | 0 |
| 0.7645833333333334 | 0 |
| 0.7652777777777778 | 0 |
| 0.7659722222222222 | 0 |
| 0.7666666666666666 | 0 |
| 0.7673611111111112 | 0 |
| 0.7680555555555556 | 0 |
| 0.7687499999999999 | 0 |
| 0.7694444444444444 | 0 |
| 0.7701388888888889 | 0 |
| 0.7708333333333334 | 0 |
| 0.7715277777777777 | 0 |
| 0.7722222222222223 | 0 |
| 0.7729166666666667 | 0 |
| 0.7736111111111111 | 0 |
| 0.7743055555555555 | 0 |
| 0.775 | 0 |
| 0.7756944444444445 | 0 |
| 0.7763888888888889 | 0 |
| 0.7770833333333332 | 0 |
| 0.7777777777777778 | 0 |
| 0.7784722222222222 | 0 |
| 0.7791666666666667 | 0 |
| 0.779861111111111 | 0 |
| 0.7805555555555556 | 0 |
| 0.78125 | 0 |
| 0.7819444444444444 | 0 |
| 0.782638888888889 | 0 |
| 0.7833333333333333 | 0 |
| 0.7840277777777778 | 0 |
| 0.7847222222222222 | 0 |
| 0.7854166666666668 | 0 |
| 0.7861111111111111 | 0 |
| 0.7868055555555555 | 0 |
| 0.7875 | 0 |
| 0.7881944444444445 | 0 |
| 0.7888888888888889 | 0 |
| 0.7895833333333333 | 0 |
| 0.7902777777777777 | 0 |
| 0.7909722222222223 | 0 |
| 0.7916666666666666 | 0 |
| 0.7923611111111111 | 0 |
| 0.7930555555555556 | 0 |
| 0.7937500000000001 | 0 |
| 0.7944444444444444 | 0 |
| 0.7951388888888888 | 0 |
| 0.7958333333333334 | 0 |
| 0.7965277777777778 | 0 |
| 0.7972222222222222 | 0 |
| 0.7979166666666666 | 0 |
| 0.7986111111111112 | 0 |
| 0.7993055555555556 | 0 |
| 0.7999999999999999 | 0 |
| 0.8006944444444444 | 0 |
| 0.8013888888888889 | 0 |
| 0.8020833333333334 | 0 |
| 0.8027777777777777 | 0 |
| 0.8034722222222223 | 0 |
| 0.8041666666666667 | 0 |
| 0.8048611111111111 | 0 |
| 0.8055555555555555 | 0 |
| 0.80625 | 0 |
| 0.8069444444444445 | 0 |
| 0.8076388888888889 | 0 |
| 0.8083333333333332 | 0 |
| 0.8090277777777778 | 0 |
| 0.8097222222222222 | 0 |
| 0.8104166666666667 | 0 |
| 0.811111111111111 | 0 |
| 0.8118055555555556 | 0 |
| 0.8125 | 0 |
| 0.8131944444444444 | 0 |
| 0.813888888888889 | 0 |
| 0.8145833333333333 | 0 |
| 0.8152777777777778 | 0 |
| 0.8159722222222222 | 0 |
| 0.8166666666666668 | 0 |
| 0.8173611111111111 | 0 |
| 0.8180555555555555 | 0 |
| 0.81875 | 0 |
| 0.8194444444444445 | 0 |
| 0.8201388888888889 | 0 |
| 0.8208333333333333 | 0 |
| 0.8215277777777777 | 0 |
| 0.8222222222222223 | 0 |
| 0.8229166666666666 | 0 |
| 0.8236111111111111 | 0 |
| 0.8243055555555556 | 0 |
| 0.8250000000000001 | 0 |
| 0.8256944444444444 | 0 |
| 0.8263888888888888 | 0 |
| 0.8270833333333334 | 0 |
| 0.8277777777777778 | 0 |
| 0.8284722222222222 | 0 |
| 0.8291666666666666 | 0 |
| 0.8298611111111112 | 0 |
| 0.8305555555555556 | 0 |
| 0.8312499999999999 | 0 |
| 0.8319444444444444 | 0 |
| 0.8326388888888889 | 0 |
| 0.8333333333333334 | 0 |
| 0.8340277777777777 | 0 |
| 0.8347222222222223 | 0 |
| 0.8354166666666667 | 0 |
| 0.8361111111111111 | 0 |
| 0.8368055555555555 | 0 |
| 0.8375 | 0 |
| 0.8381944444444445 | 0 |
| 0.8388888888888889 | 0 |
| 0.8395833333333332 | 0 |
| 0.8402777777777778 | 0 |
| 0.8409722222222222 | 0 |
| 0.8416666666666667 | 0 |
| 0.842361111111111 | 0 |
| 0.8430555555555556 | 0 |
| 0.84375 | 0 |
| 0.8444444444444444 | 0 |
| 0.845138888888889 | 0 |
| 0.8458333333333333 | 0 |
| 0.8465277777777778 | 0 |
| 0.8472222222222222 | 0 |
| 0.8479166666666668 | 0 |
| 0.8486111111111111 | 0 |
| 0.8493055555555555 | 0 |
| 0.85 | 0 |
| 0.8506944444444445 | 0 |
| 0.8513888888888889 | 0 |
| 0.8520833333333333 | 0 |
| 0.8527777777777777 | 0 |
| 0.8534722222222223 | 0 |
| 0.8541666666666666 | 0 |
| 0.8548611111111111 | 0 |
| 0.8555555555555556 | 0 |
| 0.8562500000000001 | 0 |
| 0.8569444444444444 | 0 |
| 0.8576388888888888 | 0 |
| 0.8583333333333334 | 0 |
| 0.8590277777777778 | 0 |
| 0.8597222222222222 | 0 |
| 0.8604166666666666 | 0 |
| 0.8611111111111112 | 0 |
| 0.8618055555555556 | 0 |
| 0.8624999999999999 | 0 |
| 0.8631944444444444 | 0 |
| 0.8638888888888889 | 0 |
| 0.8645833333333334 | 0 |
| 0.8652777777777777 | 0 |
| 0.8659722222222223 | 0 |
| 0.8666666666666667 | 0 |
| 0.8673611111111111 | 0 |
| 0.8680555555555555 | 0 |
| 0.86875 | 0 |
| 0.8694444444444445 | 0 |
| 0.8701388888888889 | 0 |
| 0.8708333333333332 | 0 |
| 0.8715277777777778 | 0 |
| 0.8722222222222222 | 0 |
| 0.8729166666666667 | 0 |
| 0.873611111111111 | 0 |
| 0.8743055555555556 | 0 |
| 0.875 | 0 |
| 0.8756944444444444 | 0 |
| 0.876388888888889 | 0 |
| 0.8770833333333333 | 0 |
| 0.8777777777777778 | 0 |
| 0.8784722222222222 | 0 |
| 0.8791666666666668 | 0 |
| 0.8798611111111111 | 0 |
| 0.8805555555555555 | 0 |
| 0.88125 | 0 |
| 0.8819444444444445 | 0 |
| 0.8826388888888889 | 0 |
| 0.8833333333333333 | 0 |
| 0.8840277777777777 | 0 |
| 0.8847222222222223 | 0 |
| 0.8854166666666666 | 0 |
| 0.8861111111111111 | 0 |
| 0.8868055555555556 | 0 |
| 0.8875000000000001 | 0 |
| 0.8881944444444444 | 0 |
| 0.8888888888888888 | 0 |
| 0.8895833333333334 | 0 |
| 0.8902777777777778 | 0 |
| 0.8909722222222222 | 0 |
| 0.8916666666666666 | 0 |
| 0.8923611111111112 | 0 |
| 0.8930555555555556 | 0 |
| 0.8937499999999999 | 0 |
| 0.8944444444444444 | 0 |
| 0.8951388888888889 | 0 |
| 0.8958333333333334 | 0 |
| 0.8965277777777777 | 0 |
| 0.8972222222222223 | 0 |
| 0.8979166666666667 | 0 |
| 0.8986111111111111 | 0 |
| 0.8993055555555555 | 0 |
| 0.9 | 0 |
| 0.9006944444444445 | 0 |
| 0.9013888888888889 | 0 |
| 0.9020833333333332 | 0 |
| 0.9027777777777778 | 0 |
| 0.9034722222222222 | 0 |
| 0.9041666666666667 | 0 |
| 0.904861111111111 | 0 |
| 0.9055555555555556 | 0 |
| 0.90625 | 0 |
| 0.9069444444444444 | 0 |
| 0.907638888888889 | 0 |
| 0.9083333333333333 | 0 |
| 0.9090277777777778 | 0 |
| 0.9097222222222222 | 0 |
| 0.9104166666666668 | 0 |
| 0.9111111111111111 | 0 |
| 0.9118055555555555 | 0 |
| 0.9125 | 0 |
| 0.9131944444444445 | 0 |
| 0.9138888888888889 | 0 |
| 0.9145833333333333 | 0 |
| 0.9152777777777777 | 0 |
| 0.9159722222222223 | 0 |
| 0.9166666666666666 | 0 |
| 0.9173611111111111 | 0 |
| 0.9180555555555556 | 0 |
| 0.9187500000000001 | 0 |
| 0.9194444444444444 | 0 |
| 0.9201388888888888 | 0 |
| 0.9208333333333334 | 0 |
| 0.9215277777777778 | 0 |
| 0.9222222222222222 | 0 |
| 0.9229166666666666 | 0 |
| 0.9236111111111112 | 0 |
| 0.9243055555555556 | 0 |
| 0.9249999999999999 | 0 |
| 0.9256944444444444 | 0 |
| 0.9263888888888889 | 0 |
| 0.9270833333333334 | 0 |
| 0.9277777777777777 | 0 |
| 0.9284722222222223 | 0 |
| 0.9291666666666667 | 0 |
| 0.9298611111111111 | 0 |
| 0.9305555555555555 | 0 |
| 0.93125 | 0 |
| 0.9319444444444445 | 0 |
| 0.9326388888888889 | 0 |
| 0.9333333333333332 | 0 |
| 0.9340277777777778 | 0 |
| 0.9347222222222222 | 0 |
| 0.9354166666666667 | 0 |
| 0.936111111111111 | 0 |
| 0.9368055555555556 | 0 |
| 0.9375 | 0 |
| 0.9381944444444444 | 0 |
| 0.938888888888889 | 0 |
| 0.9395833333333333 | 0 |
| 0.9402777777777778 | 0 |
| 0.9409722222222222 | 0 |
| 0.9416666666666668 | 0 |
| 0.9423611111111111 | 0 |
| 0.9430555555555555 | 0 |
| 0.94375 | 0 |
| 0.9444444444444445 | 0 |
| 0.9451388888888889 | 0 |
| 0.9458333333333333 | 0 |
| 0.9465277777777777 | 0 |
| 0.9472222222222223 | 0 |
| 0.9479166666666666 | 0 |
| 0.9486111111111111 | 0 |
| 0.9493055555555556 | 0 |
| 0.9500000000000001 | 0 |
| 0.9506944444444444 | 0 |
| 0.9513888888888888 | 0 |
| 0.9520833333333334 | 0 |
| 0.9527777777777778 | 0 |
| 0.9534722222222222 | 0 |
| 0.9541666666666666 | 0 |
| 0.9548611111111112 | 0 |
| 0.9555555555555556 | 0 |
| 0.9562499999999999 | 0 |
| 0.9569444444444444 | 0 |
| 0.9576388888888889 | 0 |
| 0.9583333333333334 | 0 |
| 0.9590277777777777 | 0 |
| 0.9597222222222223 | 0 |
| 0.9604166666666667 | 0 |
| 0.9611111111111111 | 0 |
| 0.9618055555555555 | 0 |
| 0.9625 | 0 |
| 0.9631944444444445 | 0 |
| 0.9638888888888889 | 0 |
| 0.9645833333333332 | 0 |
| 0.9652777777777778 | 0 |
| 0.9659722222222222 | 0 |
| 0.9666666666666667 | 0 |
| 0.967361111111111 | 0 |
| 0.9680555555555556 | 0 |
| 0.96875 | 0 |
| 0.9694444444444444 | 0 |
| 0.970138888888889 | 0 |
| 0.9708333333333333 | 0 |
| 0.9715277777777778 | 0 |
| 0.9722222222222222 | 0 |
| 0.9729166666666668 | 0 |
| 0.9736111111111111 | 0 |
| 0.9743055555555555 | 0 |
| 0.975 | 0 |
| 0.9756944444444445 | 0 |
| 0.9763888888888889 | 0 |
| 0.9770833333333333 | 0 |
| 0.9777777777777777 | 0 |
| 0.9784722222222223 | 0 |
| 0.9791666666666666 | 0 |
| 0.9798611111111111 | 0 |
| 0.9805555555555556 | 0 |
| 0.9812500000000001 | 0 |
| 0.9819444444444444 | 0 |
| 0.9826388888888888 | 0 |
| 0.9833333333333334 | 0 |
| 0.9840277777777778 | 0 |
| 0.9847222222222222 | 0 |
| 0.9854166666666666 | 0 |
| 0.9861111111111112 | 0 |
| 0.9868055555555556 | 0 |
| 0.9874999999999999 | 0 |
| 0.9881944444444444 | 0 |
| 0.9888888888888889 | 0 |
| 0.9895833333333334 | 0 |
| 0.9902777777777777 | 0 |
| 0.9909722222222223 | 0 |
| 0.9916666666666667 | 0 |
| 0.9923611111111111 | 0 |
| 0.9930555555555555 | 0 |
| 0.99375 | 0 |
| 0.9944444444444445 | 0 |
| 0.9951388888888889 | 0 |
| 0.9958333333333332 | 0 |
| 0.9965277777777778 | 0 |
| 0.9972222222222222 | 0 |
| 0.9979166666666667 | 0 |
| 0.998611111111111 | 0 |
| 0.9993055555555556 | 0 |